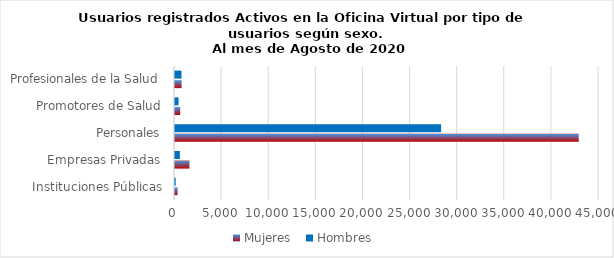
| Category | Mujeres | Hombres |
|---|---|---|
| Instituciones Públicas | 277 | 74 |
| Empresas Privadas | 1534 | 519 |
| Personales | 42849 | 28243 |
| Promotores de Salud | 555 | 380 |
| Profesionales de la Salud | 700 | 688 |